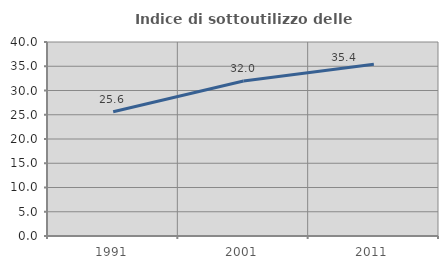
| Category | Indice di sottoutilizzo delle abitazioni  |
|---|---|
| 1991.0 | 25.613 |
| 2001.0 | 31.96 |
| 2011.0 | 35.404 |